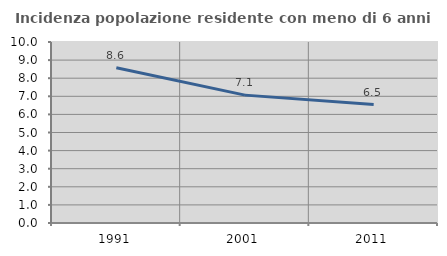
| Category | Incidenza popolazione residente con meno di 6 anni |
|---|---|
| 1991.0 | 8.577 |
| 2001.0 | 7.065 |
| 2011.0 | 6.545 |